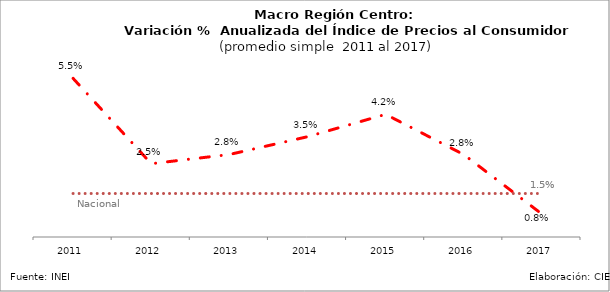
| Category | Series 0 | Nacional |
|---|---|---|
| 2011.0 | 0.055 | 0.015 |
| 2012.0 | 0.025 | 0.015 |
| 2013.0 | 0.028 | 0.015 |
| 2014.0 | 0.035 | 0.015 |
| 2015.0 | 0.042 | 0.015 |
| 2016.0 | 0.028 | 0.015 |
| 2017.0 | 0.008 | 0.015 |